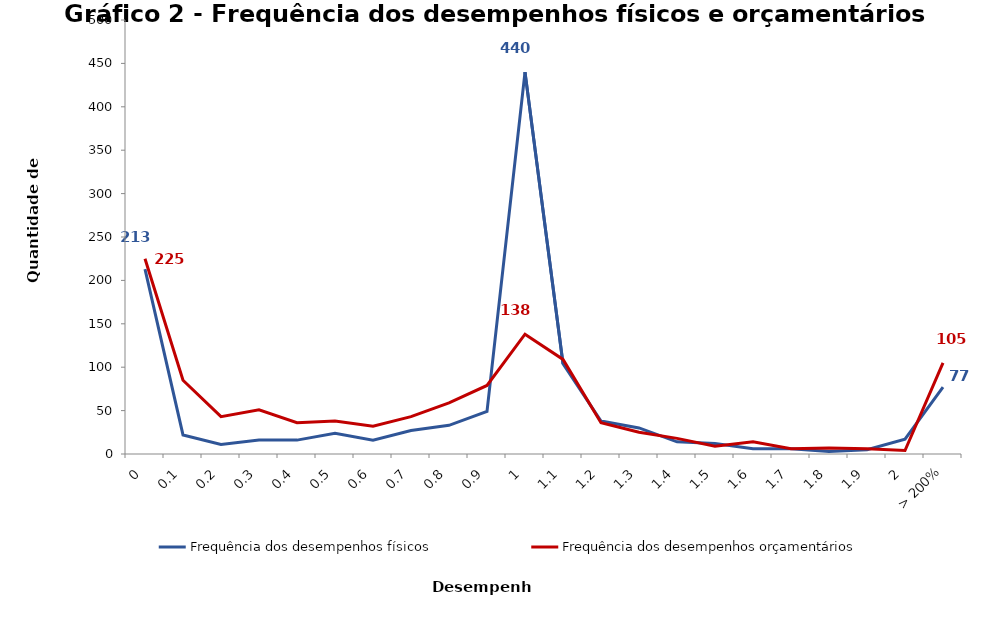
| Category | Frequência dos desempenhos físicos | Frequência dos desempenhos orçamentários |
|---|---|---|
| 0 | 213 | 225 |
| 0,1 | 22 | 85 |
| 0,2 | 11 | 43 |
| 0,3 | 16 | 51 |
| 0,4 | 16 | 36 |
| 0,5 | 24 | 38 |
| 0,6 | 16 | 32 |
| 0,7 | 27 | 43 |
| 0,8 | 33 | 59 |
| 0,9 | 49 | 79 |
| 1 | 440 | 138 |
| 1,1 | 104 | 109 |
| 1,2 | 38 | 36 |
| 1,3 | 30 | 25 |
| 1,4 | 14 | 18 |
| 1,5 | 12 | 9 |
| 1,6 | 6 | 14 |
| 1,7 | 6 | 6 |
| 1,8 | 3 | 7 |
| 1,9 | 5 | 6 |
| 2 | 17 | 4 |
| > 200% | 77 | 105 |